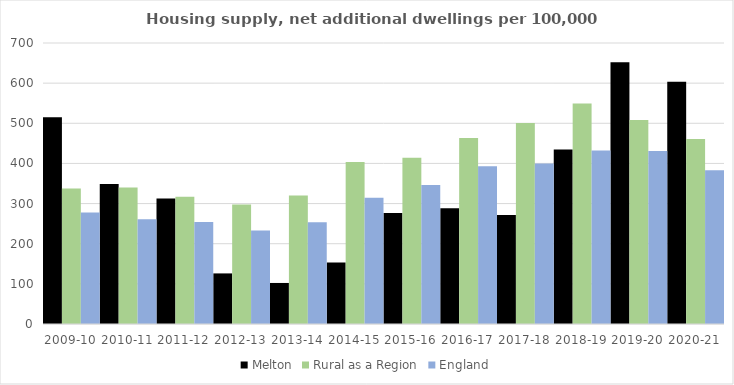
| Category | Melton | Rural as a Region | England |
|---|---|---|---|
| 2009-10 | 514.945 | 337.852 | 277.548 |
| 2010-11 | 349.062 | 340.105 | 260.994 |
| 2011-12 | 312.902 | 317.04 | 254.007 |
| 2012-13 | 126.021 | 297.763 | 233.153 |
| 2013-14 | 102.225 | 319.835 | 253.602 |
| 2014-15 | 152.905 | 403.796 | 314.256 |
| 2015-16 | 276.709 | 414.091 | 346.154 |
| 2016-17 | 288.422 | 463.209 | 393.256 |
| 2017-18 | 271.264 | 500.68 | 399.646 |
| 2018-19 | 434.442 | 549.491 | 432.099 |
| 2019-20 | 652.229 | 508.493 | 431.187 |
| 2020-21 | 603.183 | 461.114 | 382.827 |